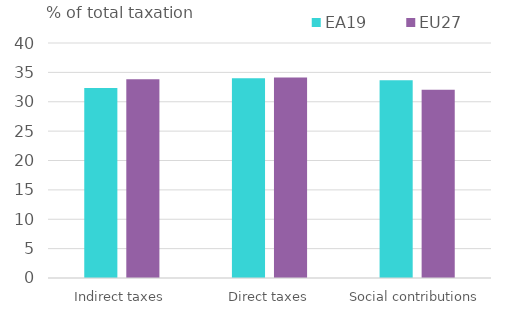
| Category | EA19 | EU27 |
|---|---|---|
| Indirect taxes | 32.329 | 33.811 |
| Direct taxes | 34.001 | 34.133 |
| Social contributions | 33.67 | 32.056 |